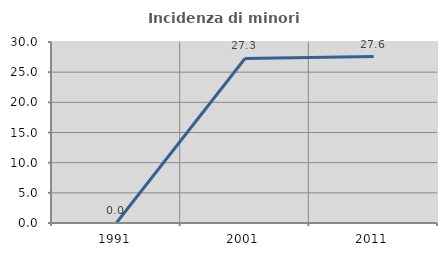
| Category | Incidenza di minori stranieri |
|---|---|
| 1991.0 | 0 |
| 2001.0 | 27.273 |
| 2011.0 | 27.586 |